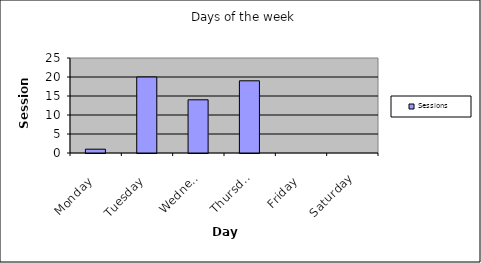
| Category | Sessions |
|---|---|
| Monday | 1 |
| Tuesday | 20 |
| Wednesday | 14 |
| Thursday | 19 |
| Friday | 0 |
| Saturday | 0 |